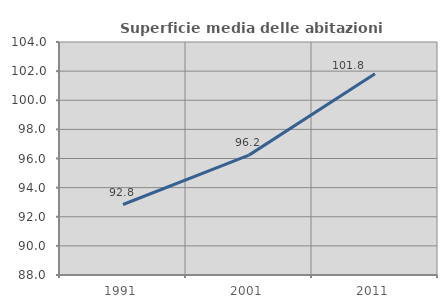
| Category | Superficie media delle abitazioni occupate |
|---|---|
| 1991.0 | 92.84 |
| 2001.0 | 96.232 |
| 2011.0 | 101.822 |